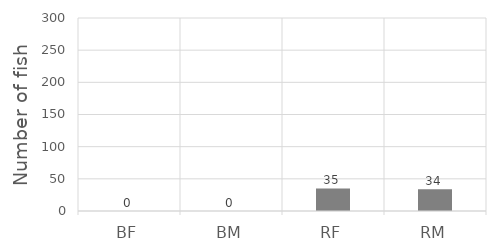
| Category | Series 0 |
|---|---|
| BF | 0 |
| BM | 0 |
| RF | 35 |
| RM | 34 |